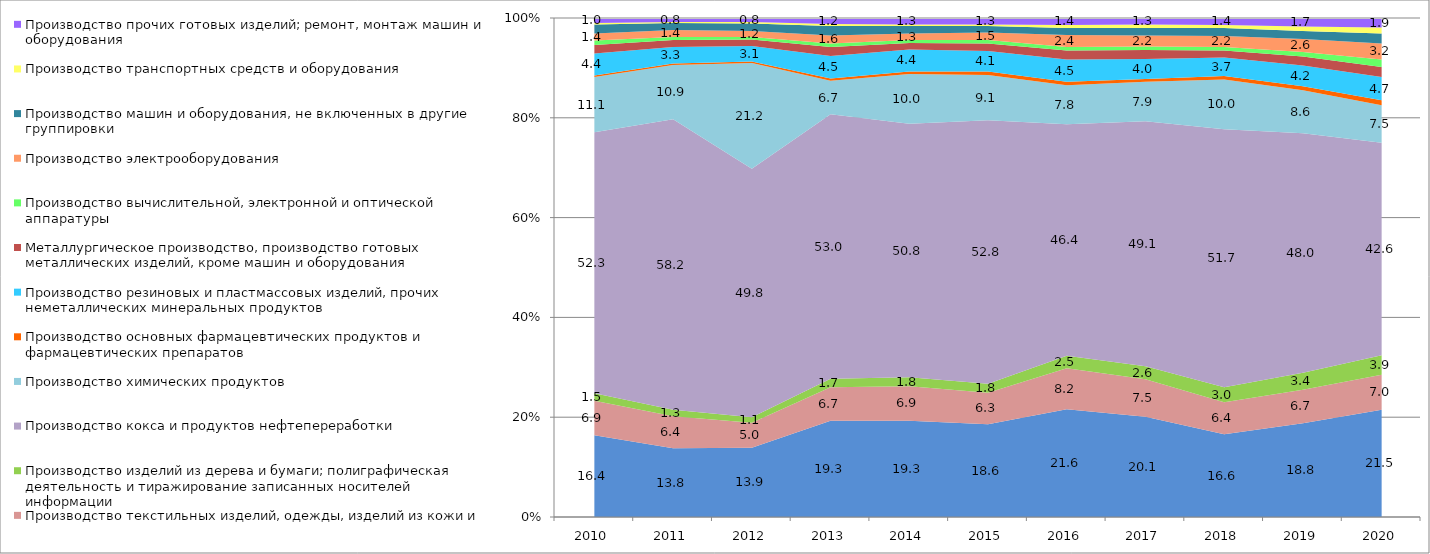
| Category | Производство продуктов питания, напитков и табачных изделий | Производство текстильных изделий, одежды, изделий из кожи и меха | Производство изделий из дерева и бумаги; полиграфическая деятельность и тиражирование записанных носителей информации | Производство кокса и продуктов нефтепереработки | Производство химических продуктов | Производство основных фармацевтических продуктов и фармацевтических препаратов | Производство резиновых и пластмассовых изделий, прочих неметаллических минеральных продуктов | Металлургическое производство, производство готовых металлических изделий, кроме машин и оборудования | Производство вычислительной, электронной и оптической аппаратуры | Производство электрооборудования | Производство машин и оборудования, не включенных в другие группировки | Производство транспортных средств и оборудования | Производство прочих готовых изделий; ремонт, монтаж машин и оборудования |
|---|---|---|---|---|---|---|---|---|---|---|---|---|---|
| 2010.0 | 16.4 | 6.9 | 1.5 | 52.3 | 11.1 | 0.3 | 4.4 | 1.7 | 0.9 | 1.4 | 1.8 | 0.3 | 1 |
| 2011.0 | 13.8 | 6.4 | 1.3 | 58.2 | 10.9 | 0.3 | 3.3 | 1.4 | 0.6 | 1.4 | 1.4 | 0.2 | 0.8 |
| 2012.0 | 13.9 | 5 | 1.1 | 49.8 | 21.2 | 0.3 | 3.1 | 1.3 | 0.5 | 1.2 | 1.5 | 0.3 | 0.8 |
| 2013.0 | 19.3 | 6.7 | 1.7 | 53 | 6.7 | 0.5 | 4.5 | 1.8 | 0.7 | 1.6 | 1.9 | 0.4 | 1.2 |
| 2014.0 | 19.3 | 6.9 | 1.8 | 50.8 | 10 | 0.5 | 4.4 | 1.3 | 0.6 | 1.3 | 1.5 | 0.3 | 1.3 |
| 2015.0 | 18.6 | 6.3 | 1.8 | 52.8 | 9.1 | 0.7 | 4.1 | 1.5 | 0.7 | 1.5 | 1.3 | 0.3 | 1.3 |
| 2016.0 | 21.6 | 8.2 | 2.5 | 46.4 | 7.8 | 0.7 | 4.5 | 1.8 | 0.7 | 2.4 | 1.4 | 0.6 | 1.4 |
| 2017.0 | 20.1 | 7.5 | 2.6 | 49.1 | 7.9 | 0.6 | 4 | 1.8 | 0.7 | 2.2 | 1.5 | 0.7 | 1.3 |
| 2018.0 | 16.6 | 6.4 | 3 | 51.7 | 10 | 0.7 | 3.7 | 1.4 | 0.7 | 2.2 | 1.6 | 0.6 | 1.4 |
| 2019.0 | 18.8 | 6.7 | 3.4 | 48 | 8.6 | 0.8 | 4.2 | 1.8 | 0.9 | 2.6 | 1.6 | 0.9 | 1.7 |
| 2020.0 | 21.5 | 7 | 3.9 | 42.6 | 7.5 | 1 | 4.7 | 2 | 1.5 | 3.2 | 2 | 1.2 | 1.9 |